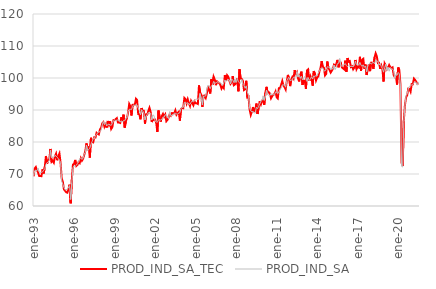
| Category | PROD_IND_SA_TEC | PROD_IND_SA |
|---|---|---|
| 1993-01-01 | 69.268 | 69.487 |
| 1993-02-01 | 71.73 | 71.023 |
| 1993-03-01 | 72.178 | 71.131 |
| 1993-04-01 | 71.175 | 71.012 |
| 1993-05-01 | 70.474 | 71.881 |
| 1993-06-01 | 69.364 | 70.634 |
| 1993-07-01 | 69.379 | 70.475 |
| 1993-08-01 | 69.322 | 70.457 |
| 1993-09-01 | 71.454 | 70.676 |
| 1993-10-01 | 70.19 | 71.182 |
| 1993-11-01 | 72.227 | 71.66 |
| 1993-12-01 | 75.62 | 72.994 |
| 1994-01-01 | 73.297 | 73.565 |
| 1994-02-01 | 74.292 | 73.688 |
| 1994-03-01 | 74.672 | 74.357 |
| 1994-04-01 | 77.837 | 77.425 |
| 1994-05-01 | 73.803 | 75.094 |
| 1994-06-01 | 74.157 | 75.258 |
| 1994-07-01 | 73.538 | 75.227 |
| 1994-08-01 | 75.484 | 75.838 |
| 1994-09-01 | 76.339 | 75.602 |
| 1994-10-01 | 74.308 | 75.256 |
| 1994-11-01 | 75.599 | 74.773 |
| 1994-12-01 | 76.412 | 74.272 |
| 1995-01-01 | 73.499 | 73.632 |
| 1995-02-01 | 68.587 | 67.786 |
| 1995-03-01 | 67.601 | 66.808 |
| 1995-04-01 | 65.179 | 65.83 |
| 1995-05-01 | 64.747 | 65.086 |
| 1995-06-01 | 64.298 | 65.008 |
| 1995-07-01 | 64.162 | 65.393 |
| 1995-08-01 | 65.174 | 65.651 |
| 1995-09-01 | 66.626 | 66.389 |
| 1995-10-01 | 60.831 | 62.036 |
| 1995-11-01 | 68.152 | 67.34 |
| 1995-12-01 | 72.943 | 71.938 |
| 1996-01-01 | 73.14 | 72.559 |
| 1996-02-01 | 74.4 | 72.387 |
| 1996-03-01 | 72.523 | 72.725 |
| 1996-04-01 | 72.839 | 73.289 |
| 1996-05-01 | 73.714 | 73.749 |
| 1996-06-01 | 73.388 | 74.798 |
| 1996-07-01 | 74.932 | 75.028 |
| 1996-08-01 | 74.162 | 74.533 |
| 1996-09-01 | 74.768 | 74.99 |
| 1996-10-01 | 75.961 | 76.175 |
| 1996-11-01 | 77.195 | 76.797 |
| 1996-12-01 | 79.575 | 79.045 |
| 1997-01-01 | 78.088 | 77.205 |
| 1997-02-01 | 78.343 | 77.704 |
| 1997-03-01 | 75.12 | 78.046 |
| 1997-04-01 | 81.298 | 79.3 |
| 1997-05-01 | 80.009 | 80.101 |
| 1997-06-01 | 79.889 | 81.068 |
| 1997-07-01 | 81.49 | 80.999 |
| 1997-08-01 | 81.395 | 82.043 |
| 1997-09-01 | 82.883 | 82.263 |
| 1997-10-01 | 82.577 | 82.948 |
| 1997-11-01 | 82.36 | 83.094 |
| 1997-12-01 | 83.93 | 83.24 |
| 1998-01-01 | 84.394 | 83.683 |
| 1998-02-01 | 85.795 | 85.272 |
| 1998-03-01 | 86.194 | 86.38 |
| 1998-04-01 | 84.753 | 85.428 |
| 1998-05-01 | 85.484 | 86.188 |
| 1998-06-01 | 84.516 | 85.011 |
| 1998-07-01 | 86.572 | 85.502 |
| 1998-08-01 | 85.403 | 85.568 |
| 1998-09-01 | 86.508 | 85.328 |
| 1998-10-01 | 84.085 | 85.199 |
| 1998-11-01 | 84.636 | 85.836 |
| 1998-12-01 | 86.832 | 86.535 |
| 1999-01-01 | 86.887 | 86.984 |
| 1999-02-01 | 87.142 | 86.645 |
| 1999-03-01 | 87.467 | 86.835 |
| 1999-04-01 | 86.106 | 86.896 |
| 1999-05-01 | 86.094 | 86.688 |
| 1999-06-01 | 85.955 | 86.202 |
| 1999-07-01 | 87.746 | 86.642 |
| 1999-08-01 | 86.589 | 86.21 |
| 1999-09-01 | 88.537 | 86.748 |
| 1999-10-01 | 84.487 | 86.644 |
| 1999-11-01 | 86.448 | 87.517 |
| 1999-12-01 | 87.476 | 87.517 |
| 2000-01-01 | 89.235 | 89.508 |
| 2000-02-01 | 91.899 | 90.178 |
| 2000-03-01 | 91.165 | 90.206 |
| 2000-04-01 | 88.283 | 90.127 |
| 2000-05-01 | 91.607 | 91.152 |
| 2000-06-01 | 91.641 | 91.651 |
| 2000-07-01 | 91.701 | 91.344 |
| 2000-08-01 | 93.511 | 91.668 |
| 2000-09-01 | 93.121 | 91.52 |
| 2000-10-01 | 88.755 | 90.601 |
| 2000-11-01 | 88.7 | 89.834 |
| 2000-12-01 | 87.092 | 88.47 |
| 2001-01-01 | 90.614 | 90.058 |
| 2001-02-01 | 89.672 | 89.724 |
| 2001-03-01 | 89.71 | 89.084 |
| 2001-04-01 | 85.739 | 86.893 |
| 2001-05-01 | 88.647 | 88.029 |
| 2001-06-01 | 88.571 | 88.616 |
| 2001-07-01 | 89.664 | 89.205 |
| 2001-08-01 | 90.701 | 88.967 |
| 2001-09-01 | 89.471 | 88.969 |
| 2001-10-01 | 86.242 | 86.87 |
| 2001-11-01 | 87.064 | 88.448 |
| 2001-12-01 | 86.884 | 88.29 |
| 2002-01-01 | 86.99 | 86.545 |
| 2002-02-01 | 86.012 | 86.292 |
| 2002-03-01 | 83.142 | 86.173 |
| 2002-04-01 | 89.839 | 86.927 |
| 2002-05-01 | 87.761 | 87.016 |
| 2002-06-01 | 86.382 | 86.848 |
| 2002-07-01 | 88.136 | 87.107 |
| 2002-08-01 | 88.798 | 87.76 |
| 2002-09-01 | 87.937 | 87.734 |
| 2002-10-01 | 88.584 | 88.544 |
| 2002-11-01 | 86.496 | 88.266 |
| 2002-12-01 | 86.921 | 88.1 |
| 2003-01-01 | 87.605 | 87.292 |
| 2003-02-01 | 88.712 | 89.468 |
| 2003-03-01 | 88.258 | 88.287 |
| 2003-04-01 | 89.05 | 88.284 |
| 2003-05-01 | 88.961 | 88.307 |
| 2003-06-01 | 88.983 | 88.989 |
| 2003-07-01 | 89.895 | 88.959 |
| 2003-08-01 | 88.531 | 88.796 |
| 2003-09-01 | 89.037 | 88.654 |
| 2003-10-01 | 89.432 | 89.085 |
| 2003-11-01 | 86.681 | 89.125 |
| 2003-12-01 | 90.278 | 90.53 |
| 2004-01-01 | 90.669 | 90.834 |
| 2004-02-01 | 90.559 | 90.841 |
| 2004-03-01 | 93.786 | 92.407 |
| 2004-04-01 | 93.459 | 92.267 |
| 2004-05-01 | 92.097 | 92.118 |
| 2004-06-01 | 93.339 | 92.29 |
| 2004-07-01 | 92.148 | 91.792 |
| 2004-08-01 | 91.253 | 91.781 |
| 2004-09-01 | 92.863 | 92.414 |
| 2004-10-01 | 92.17 | 92.829 |
| 2004-11-01 | 91.465 | 92.851 |
| 2004-12-01 | 92.672 | 92.76 |
| 2005-01-01 | 92.109 | 93.321 |
| 2005-02-01 | 92.088 | 93.414 |
| 2005-03-01 | 91.888 | 93.294 |
| 2005-04-01 | 97.683 | 93.587 |
| 2005-05-01 | 95.522 | 95.131 |
| 2005-06-01 | 94.734 | 93.447 |
| 2005-07-01 | 90.981 | 91.592 |
| 2005-08-01 | 94.481 | 94.348 |
| 2005-09-01 | 94.5 | 94.309 |
| 2005-10-01 | 93.762 | 94.395 |
| 2005-11-01 | 95.204 | 96.236 |
| 2005-12-01 | 97.324 | 97.789 |
| 2006-01-01 | 96.168 | 97.337 |
| 2006-02-01 | 95.166 | 96.676 |
| 2006-03-01 | 99.593 | 97.57 |
| 2006-04-01 | 97.817 | 97.798 |
| 2006-05-01 | 100.389 | 98.928 |
| 2006-06-01 | 99.531 | 98.292 |
| 2006-07-01 | 97.768 | 98.444 |
| 2006-08-01 | 98.951 | 98.799 |
| 2006-09-01 | 98.641 | 98.776 |
| 2006-10-01 | 98.383 | 98.472 |
| 2006-11-01 | 97.843 | 98.599 |
| 2006-12-01 | 96.709 | 98.204 |
| 2007-01-01 | 97.37 | 97.626 |
| 2007-02-01 | 96.85 | 98.49 |
| 2007-03-01 | 100.934 | 99.361 |
| 2007-04-01 | 99.11 | 99.031 |
| 2007-05-01 | 100.864 | 99.146 |
| 2007-06-01 | 100.413 | 99.538 |
| 2007-07-01 | 99.178 | 99.421 |
| 2007-08-01 | 98.15 | 98.149 |
| 2007-09-01 | 98.637 | 99.706 |
| 2007-10-01 | 100.614 | 99.414 |
| 2007-11-01 | 97.75 | 98.576 |
| 2007-12-01 | 97.996 | 99.604 |
| 2008-01-01 | 98.459 | 98.57 |
| 2008-02-01 | 99.862 | 99.904 |
| 2008-03-01 | 95.874 | 98.804 |
| 2008-04-01 | 102.729 | 98.479 |
| 2008-05-01 | 99.802 | 98.364 |
| 2008-06-01 | 99.702 | 99.549 |
| 2008-07-01 | 99.093 | 98.031 |
| 2008-08-01 | 96.225 | 97.656 |
| 2008-09-01 | 96.466 | 96.778 |
| 2008-10-01 | 99.117 | 97.553 |
| 2008-11-01 | 93.914 | 95.618 |
| 2008-12-01 | 94.156 | 94.579 |
| 2009-01-01 | 90.155 | 90.558 |
| 2009-02-01 | 88.479 | 89.748 |
| 2009-03-01 | 89.546 | 89.382 |
| 2009-04-01 | 90.916 | 89.596 |
| 2009-05-01 | 89.653 | 89.119 |
| 2009-06-01 | 89.817 | 89.057 |
| 2009-07-01 | 92.01 | 90.868 |
| 2009-08-01 | 88.749 | 90.403 |
| 2009-09-01 | 90.73 | 91.163 |
| 2009-10-01 | 92.763 | 91.854 |
| 2009-11-01 | 91.766 | 92.754 |
| 2009-12-01 | 92.932 | 92.985 |
| 2010-01-01 | 93.027 | 94.416 |
| 2010-02-01 | 91.618 | 93.039 |
| 2010-03-01 | 95.447 | 94.445 |
| 2010-04-01 | 97.239 | 96.202 |
| 2010-05-01 | 95.366 | 94.768 |
| 2010-06-01 | 95.576 | 94.605 |
| 2010-07-01 | 95.168 | 94.434 |
| 2010-08-01 | 93.653 | 95.195 |
| 2010-09-01 | 94.29 | 94.724 |
| 2010-10-01 | 94.788 | 94.852 |
| 2010-11-01 | 94.93 | 94.611 |
| 2010-12-01 | 95.753 | 95.615 |
| 2011-01-01 | 94.005 | 95.6 |
| 2011-02-01 | 93.613 | 95.104 |
| 2011-03-01 | 96.802 | 95.758 |
| 2011-04-01 | 96.777 | 96.288 |
| 2011-05-01 | 97.891 | 96.92 |
| 2011-06-01 | 99.064 | 97.84 |
| 2011-07-01 | 97.647 | 97.856 |
| 2011-08-01 | 97.171 | 97.848 |
| 2011-09-01 | 96.414 | 97.116 |
| 2011-10-01 | 99.014 | 99.105 |
| 2011-11-01 | 100.965 | 99.892 |
| 2011-12-01 | 99.887 | 100.187 |
| 2012-01-01 | 97.464 | 99.149 |
| 2012-02-01 | 99.519 | 99.289 |
| 2012-03-01 | 100.349 | 99.587 |
| 2012-04-01 | 99.805 | 100.231 |
| 2012-05-01 | 102.436 | 100.109 |
| 2012-06-01 | 101.338 | 100.512 |
| 2012-07-01 | 101.861 | 102.018 |
| 2012-08-01 | 99.92 | 100.286 |
| 2012-09-01 | 98.93 | 100.995 |
| 2012-10-01 | 101.056 | 99.864 |
| 2012-11-01 | 101.99 | 100.596 |
| 2012-12-01 | 97.85 | 99.403 |
| 2013-01-01 | 99.188 | 99.922 |
| 2013-02-01 | 99.121 | 100.479 |
| 2013-03-01 | 96.591 | 100.094 |
| 2013-04-01 | 102.389 | 98.919 |
| 2013-05-01 | 102.693 | 100.15 |
| 2013-06-01 | 99.121 | 99.19 |
| 2013-07-01 | 100.603 | 99.754 |
| 2013-08-01 | 99.799 | 100.378 |
| 2013-09-01 | 97.609 | 99.681 |
| 2013-10-01 | 102.167 | 100.659 |
| 2013-11-01 | 101.305 | 100.399 |
| 2013-12-01 | 99.246 | 100.889 |
| 2014-01-01 | 100.163 | 100.827 |
| 2014-02-01 | 100.448 | 101.565 |
| 2014-03-01 | 102.091 | 102.228 |
| 2014-04-01 | 103.159 | 102.952 |
| 2014-05-01 | 105.282 | 103.06 |
| 2014-06-01 | 103.365 | 103.184 |
| 2014-07-01 | 103.222 | 102.206 |
| 2014-08-01 | 100.813 | 102.217 |
| 2014-09-01 | 101.273 | 102.695 |
| 2014-10-01 | 105.159 | 103.528 |
| 2014-11-01 | 103.201 | 103.395 |
| 2014-12-01 | 102.532 | 103.431 |
| 2015-01-01 | 101.704 | 102.573 |
| 2015-02-01 | 102.252 | 103.2 |
| 2015-03-01 | 102.901 | 102.711 |
| 2015-04-01 | 104.163 | 104.03 |
| 2015-05-01 | 103.864 | 102.667 |
| 2015-06-01 | 104.373 | 103.267 |
| 2015-07-01 | 105.657 | 104.479 |
| 2015-08-01 | 103.351 | 104.567 |
| 2015-09-01 | 104.863 | 106.088 |
| 2015-10-01 | 104.822 | 103.944 |
| 2015-11-01 | 103.324 | 103.657 |
| 2015-12-01 | 102.991 | 103.848 |
| 2016-01-01 | 102.715 | 104.202 |
| 2016-02-01 | 105.418 | 104.522 |
| 2016-03-01 | 101.945 | 103.879 |
| 2016-04-01 | 106.248 | 103.515 |
| 2016-05-01 | 105.115 | 103.896 |
| 2016-06-01 | 105.278 | 103.473 |
| 2016-07-01 | 103.43 | 103.7 |
| 2016-08-01 | 103.677 | 103.611 |
| 2016-09-01 | 102.712 | 103.626 |
| 2016-10-01 | 103.243 | 103.873 |
| 2016-11-01 | 105.636 | 105.255 |
| 2016-12-01 | 102.788 | 104.172 |
| 2017-01-01 | 103.532 | 104.388 |
| 2017-02-01 | 103.283 | 103.948 |
| 2017-03-01 | 106.614 | 104.886 |
| 2017-04-01 | 102.274 | 103.944 |
| 2017-05-01 | 105.76 | 103.667 |
| 2017-06-01 | 106.014 | 104.111 |
| 2017-07-01 | 102.881 | 103.335 |
| 2017-08-01 | 104.193 | 103.765 |
| 2017-09-01 | 100.939 | 101.935 |
| 2017-10-01 | 103.117 | 103.858 |
| 2017-11-01 | 104.332 | 104.193 |
| 2017-12-01 | 102.153 | 104.79 |
| 2018-01-01 | 105.026 | 104.344 |
| 2018-02-01 | 104.014 | 104.582 |
| 2018-03-01 | 102.842 | 104.977 |
| 2018-04-01 | 106.447 | 104.421 |
| 2018-05-01 | 107.705 | 105.618 |
| 2018-06-01 | 106.784 | 105.341 |
| 2018-07-01 | 104.662 | 105.156 |
| 2018-08-01 | 104.728 | 104.066 |
| 2018-09-01 | 102.858 | 104.511 |
| 2018-10-01 | 103.867 | 103.592 |
| 2018-11-01 | 102.703 | 102.898 |
| 2018-12-01 | 98.91 | 101.824 |
| 2019-01-01 | 104.511 | 103.271 |
| 2019-02-01 | 103.82 | 104.283 |
| 2019-03-01 | 102.718 | 102.403 |
| 2019-04-01 | 103.263 | 103.413 |
| 2019-05-01 | 104.058 | 102.119 |
| 2019-06-01 | 103.393 | 103.273 |
| 2019-07-01 | 103.057 | 102.873 |
| 2019-08-01 | 103.306 | 102.818 |
| 2019-09-01 | 100.912 | 102.254 |
| 2019-10-01 | 100.307 | 99.875 |
| 2019-11-01 | 100.555 | 101.049 |
| 2019-12-01 | 97.948 | 100.853 |
| 2020-01-01 | 103.293 | 101.726 |
| 2020-02-01 | 102.515 | 101.323 |
| 2020-03-01 | 98.135 | 97.792 |
| 2020-04-01 | 73.508 | 72.413 |
| 2020-05-01 | 72.506 | 72.175 |
| 2020-06-01 | 86.579 | 86.015 |
| 2020-07-01 | 91.563 | 91.466 |
| 2020-08-01 | 93.954 | 94.491 |
| 2020-09-01 | 94.653 | 95.057 |
| 2020-10-01 | 96.697 | 96.512 |
| 2020-11-01 | 96.587 | 97.414 |
| 2020-12-01 | 95.745 | 97.502 |
| 2021-01-01 | 98.088 | 97.784 |
| 2021-02-01 | 98.07 | 98.17 |
| 2021-03-01 | 99.813 | 98.51 |
| 2021-04-01 | 99.436 | 98.814 |
| 2021-05-01 | 98.832 | 98.627 |
| 2021-06-01 | 98.192 | 97.742 |
| 2021-07-01 | 98.226 | 98.769 |